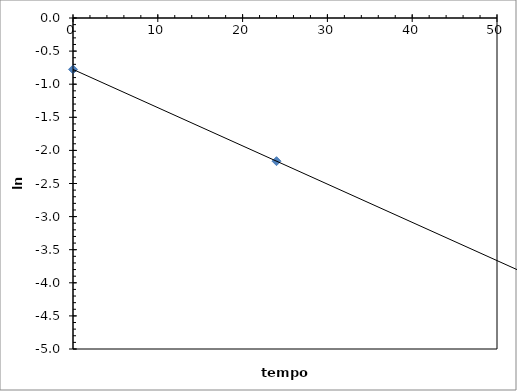
| Category | Series 0 |
|---|---|
| 0.0 | -0.777 |
| 24.0 | -2.163 |